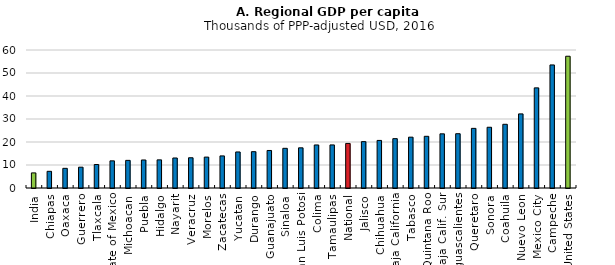
| Category | USD per head, current prices, current PPP |
|---|---|
| India | 6.566 |
| Chiapas | 7.249 |
| Oaxaca | 8.547 |
| Guerrero | 9.055 |
| Tlaxcala | 10.215 |
| State of Mexico | 11.802 |
| Michoacan | 12.013 |
| Puebla | 12.184 |
| Hidalgo | 12.229 |
| Nayarit | 13.049 |
| Veracruz | 13.146 |
| Morelos | 13.436 |
| Zacatecas | 13.953 |
| Yucatan | 15.668 |
| Durango | 15.789 |
| Guanajuato | 16.314 |
| Sinaloa | 17.249 |
| San Luis Potosi | 17.469 |
| Colima | 18.711 |
| Tamaulipas | 18.723 |
| National | 19.379 |
| Jalisco | 20.161 |
| Chihuahua | 20.685 |
| Baja California | 21.454 |
| Tabasco | 22.101 |
| Quintana Roo | 22.473 |
| Baja Calif. Sur | 23.547 |
| Aguascalientes | 23.604 |
| Queretaro | 25.928 |
| Sonora | 26.407 |
| Coahuila | 27.702 |
| Nuevo Leon | 32.215 |
| Mexico City | 43.539 |
| Campeche | 53.501 |
| United States | 57.289 |